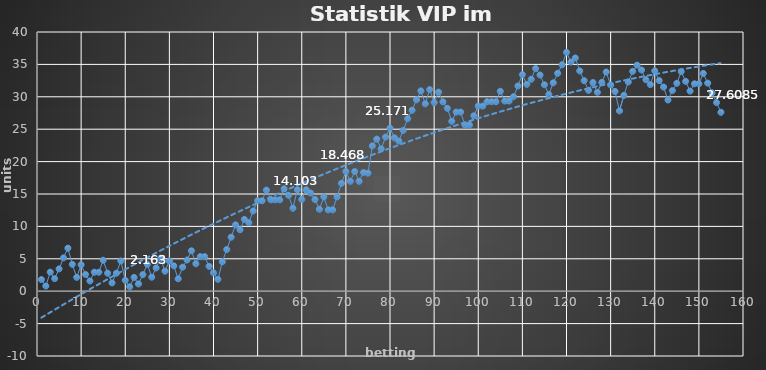
| Category | Series 0 |
|---|---|
| 0 | 1.8 |
| 1 | 0.8 |
| 2 | 2.94 |
| 3 | 1.94 |
| 4 | 3.44 |
| 5 | 5.14 |
| 6 | 6.64 |
| 7 | 4.14 |
| 8 | 2.14 |
| 9 | 4.08 |
| 10 | 2.58 |
| 11 | 1.58 |
| 12 | 2.93 |
| 13 | 2.93 |
| 14 | 4.78 |
| 15 | 2.78 |
| 16 | 1.28 |
| 17 | 2.78 |
| 18 | 4.68 |
| 19 | 1.68 |
| 20 | 0.68 |
| 21 | 2.121 |
| 22 | 1.121 |
| 23 | 2.563 |
| 24 | 4.163 |
| 25 | 2.163 |
| 26 | 3.588 |
| 27 | 5.088 |
| 28 | 3.088 |
| 29 | 4.663 |
| 30 | 3.913 |
| 31 | 1.913 |
| 32 | 3.713 |
| 33 | 4.813 |
| 34 | 6.238 |
| 35 | 4.238 |
| 36 | 5.338 |
| 37 | 5.338 |
| 38 | 3.838 |
| 39 | 2.838 |
| 40 | 1.838 |
| 41 | 4.538 |
| 42 | 6.438 |
| 43 | 8.338 |
| 44 | 10.238 |
| 45 | 9.488 |
| 46 | 11.078 |
| 47 | 10.578 |
| 48 | 12.378 |
| 49 | 13.953 |
| 50 | 13.953 |
| 51 | 15.603 |
| 52 | 14.103 |
| 53 | 14.103 |
| 54 | 14.103 |
| 55 | 15.803 |
| 56 | 14.803 |
| 57 | 12.803 |
| 58 | 15.653 |
| 59 | 14.153 |
| 60 | 15.653 |
| 61 | 15.153 |
| 62 | 14.153 |
| 63 | 12.653 |
| 64 | 14.553 |
| 65 | 12.553 |
| 66 | 12.553 |
| 67 | 14.553 |
| 68 | 16.653 |
| 69 | 18.468 |
| 70 | 16.968 |
| 71 | 18.468 |
| 72 | 16.968 |
| 73 | 18.318 |
| 74 | 18.218 |
| 75 | 22.418 |
| 76 | 23.468 |
| 77 | 21.968 |
| 78 | 23.786 |
| 79 | 25.171 |
| 80 | 23.671 |
| 81 | 23.171 |
| 82 | 24.823 |
| 83 | 26.623 |
| 84 | 27.926 |
| 85 | 29.532 |
| 86 | 30.919 |
| 87 | 28.919 |
| 88 | 31.119 |
| 89 | 29.119 |
| 90 | 30.719 |
| 91 | 29.219 |
| 92 | 28.219 |
| 93 | 26.219 |
| 94 | 27.644 |
| 95 | 27.644 |
| 96 | 25.644 |
| 97 | 25.644 |
| 98 | 27.069 |
| 99 | 28.569 |
| 100 | 28.569 |
| 101 | 29.244 |
| 102 | 29.244 |
| 103 | 29.244 |
| 104 | 30.849 |
| 105 | 29.349 |
| 106 | 29.349 |
| 107 | 30.024 |
| 108 | 31.674 |
| 109 | 33.428 |
| 110 | 31.928 |
| 111 | 32.708 |
| 112 | 34.358 |
| 113 | 33.358 |
| 114 | 31.858 |
| 115 | 30.358 |
| 116 | 32.158 |
| 117 | 33.628 |
| 118 | 34.944 |
| 119 | 36.864 |
| 120 | 35.364 |
| 121 | 35.994 |
| 122 | 33.994 |
| 123 | 32.494 |
| 124 | 30.994 |
| 125 | 32.194 |
| 126 | 30.694 |
| 127 | 32.224 |
| 128 | 33.824 |
| 129 | 31.824 |
| 130 | 30.824 |
| 131 | 27.824 |
| 132 | 30.224 |
| 133 | 32.284 |
| 134 | 33.934 |
| 135 | 34.884 |
| 136 | 34.134 |
| 137 | 32.634 |
| 138 | 31.884 |
| 139 | 34.004 |
| 140 | 32.504 |
| 141 | 31.504 |
| 142 | 29.504 |
| 143 | 30.959 |
| 144 | 32.084 |
| 145 | 33.884 |
| 146 | 32.384 |
| 147 | 30.884 |
| 148 | 32.009 |
| 149 | 32.009 |
| 150 | 33.609 |
| 151 | 32.109 |
| 152 | 30.609 |
| 153 | 29.109 |
| 154 | 27.609 |